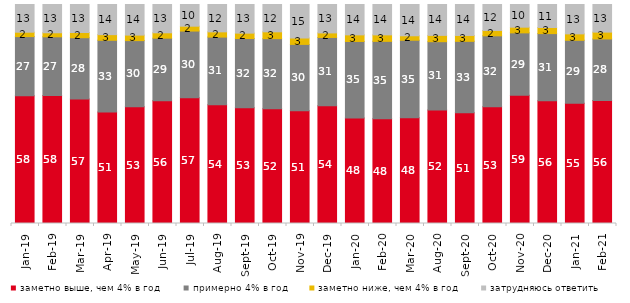
| Category | заметно выше, чем 4% в год | примерно 4% в год | заметно ниже, чем 4% в год | затрудняюсь ответить |
|---|---|---|---|---|
| 2019-01-01 | 58.3 | 27.05 | 2 | 12.65 |
| 2019-02-01 | 58.45 | 26.8 | 1.85 | 12.9 |
| 2019-03-01 | 56.887 | 27.946 | 2.387 | 12.78 |
| 2019-04-01 | 50.891 | 32.772 | 2.574 | 13.762 |
| 2019-05-01 | 53.343 | 30.163 | 2.526 | 13.967 |
| 2019-06-01 | 56.06 | 28.579 | 2.444 | 12.918 |
| 2019-07-01 | 57.475 | 30.396 | 2.228 | 9.901 |
| 2019-08-01 | 54.246 | 30.869 | 2.398 | 12.488 |
| 2019-09-01 | 52.822 | 31.634 | 2.475 | 13.069 |
| 2019-10-01 | 52.426 | 31.98 | 3.119 | 12.475 |
| 2019-11-01 | 51.485 | 30.297 | 2.921 | 15.297 |
| 2019-12-01 | 53.713 | 31.238 | 2.079 | 12.97 |
| 2020-01-01 | 48.119 | 35 | 3.02 | 13.861 |
| 2020-02-01 | 47.822 | 35.347 | 2.97 | 13.861 |
| 2020-03-01 | 48.24 | 35.449 | 2.033 | 14.279 |
| 2020-08-01 | 51.787 | 31.231 | 2.88 | 14.101 |
| 2020-09-01 | 50.523 | 32.653 | 2.688 | 14.136 |
| 2020-10-01 | 53.264 | 32.436 | 2.441 | 11.858 |
| 2020-11-01 | 58.55 | 28.5 | 2.6 | 10.35 |
| 2020-12-01 | 56.073 | 30.64 | 2.776 | 10.511 |
| 2021-01-01 | 54.893 | 28.763 | 2.931 | 13.413 |
| 2021-02-01 | 56.129 | 28.139 | 3.127 | 12.605 |